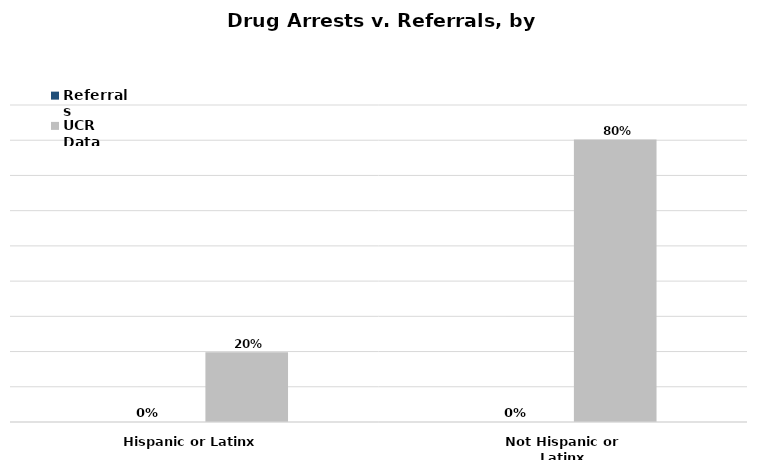
| Category | Referrals | UCR Data |
|---|---|---|
| Hispanic or Latinx | 0 | 0.198 |
| Not Hispanic or Latinx | 0 | 0.802 |